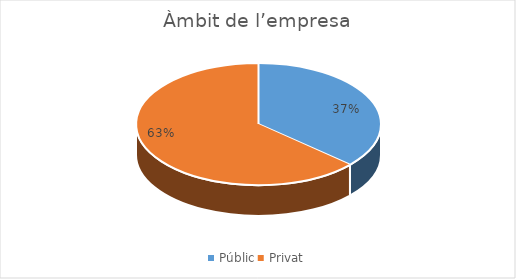
| Category | Series 0 |
|---|---|
| Públic | 15 |
| Privat | 26 |